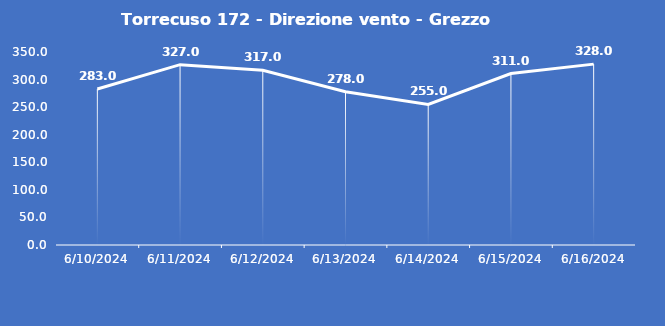
| Category | Torrecuso 172 - Direzione vento - Grezzo (°N) |
|---|---|
| 6/10/24 | 283 |
| 6/11/24 | 327 |
| 6/12/24 | 317 |
| 6/13/24 | 278 |
| 6/14/24 | 255 |
| 6/15/24 | 311 |
| 6/16/24 | 328 |